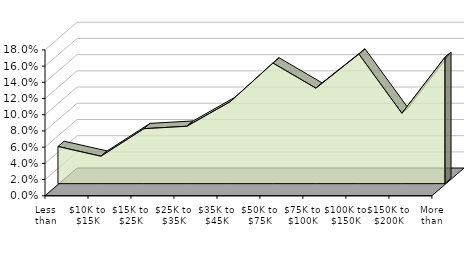
| Category | Westchester |
|---|---|
| Less than $10K | 0.047 |
| $10K to $15K | 0.035 |
| $15K to $25K | 0.069 |
| $25K to $35K | 0.072 |
| $35K to $45K | 0.102 |
| $50K to $75K | 0.15 |
| $75K to $100K | 0.119 |
| $100K to $150K | 0.161 |
| $150K to $200K | 0.088 |
| More than $200K | 0.157 |